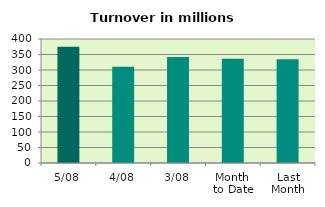
| Category | Series 0 |
|---|---|
| 5/08 | 375.27 |
| 4/08 | 310.597 |
| 3/08 | 342.044 |
| Month 
to Date | 336.433 |
| Last
Month | 334.97 |